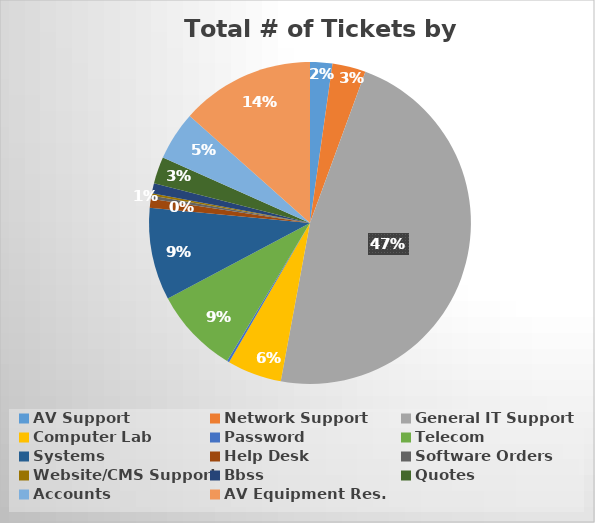
| Category | Series 0 |
|---|---|
| AV Support | 0.022 |
| Network Support | 0.034 |
| General IT Support | 0.473 |
| Computer Lab | 0.055 |
| Password | 0.002 |
| Telecom | 0.086 |
| Systems | 0.093 |
| Help Desk | 0.009 |
| Software Orders | 0.003 |
| Website/CMS Support | 0.002 |
| Bbss | 0.01 |
| Quotes | 0.027 |
| Accounts | 0.049 |
| AV Equipment Res. | 0.134 |